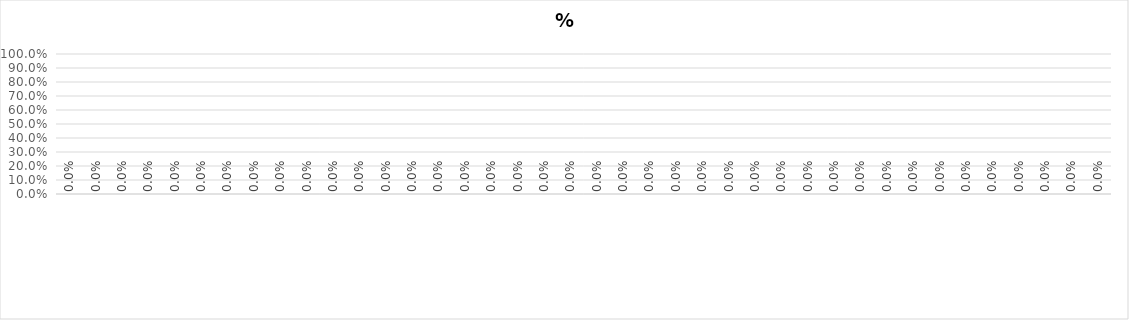
| Category | % успеваемости |
|---|---|
|   | 0 |
|   | 0 |
|   | 0 |
|   | 0 |
|   | 0 |
|   | 0 |
|   | 0 |
|   | 0 |
|   | 0 |
|   | 0 |
|   | 0 |
|   | 0 |
|   | 0 |
|   | 0 |
|   | 0 |
|   | 0 |
|   | 0 |
|   | 0 |
|   | 0 |
|   | 0 |
|   | 0 |
|   | 0 |
|   | 0 |
|   | 0 |
|   | 0 |
|   | 0 |
|   | 0 |
|   | 0 |
|   | 0 |
|   | 0 |
|   | 0 |
|   | 0 |
|   | 0 |
|   | 0 |
|   | 0 |
|   | 0 |
|   | 0 |
|   | 0 |
|   | 0 |
|   | 0 |